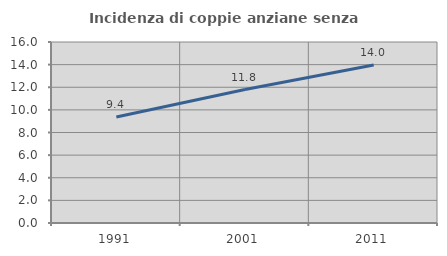
| Category | Incidenza di coppie anziane senza figli  |
|---|---|
| 1991.0 | 9.374 |
| 2001.0 | 11.801 |
| 2011.0 | 13.972 |